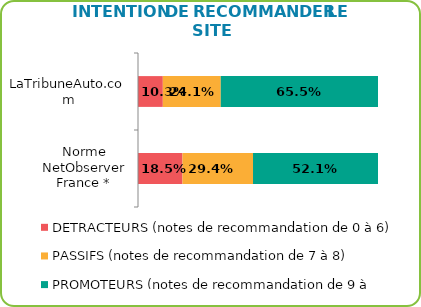
| Category | DETRACTEURS (notes de recommandation de 0 à 6) | PASSIFS (notes de recommandation de 7 à 8) | PROMOTEURS (notes de recommandation de 9 à 10) |
|---|---|---|---|
| LaTribuneAuto.com | 0.103 | 0.241 | 0.655 |
| Norme NetObserver France * | 0.185 | 0.294 | 0.521 |